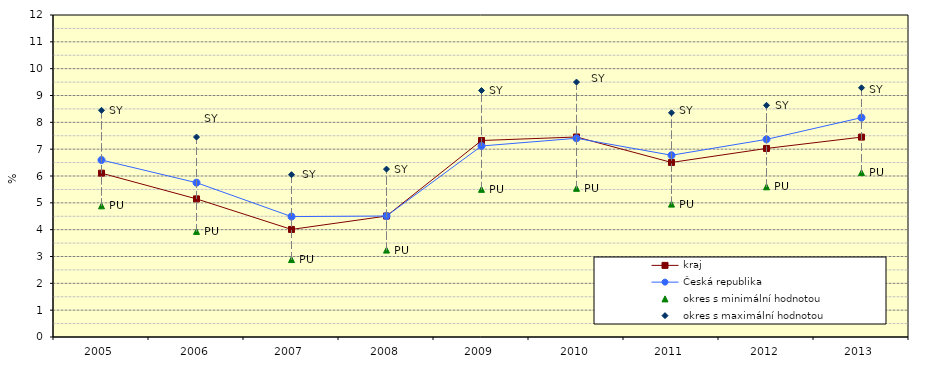
| Category | kraj | Česká republika | okres s minimální hodnotou | okres s maximální hodnotou |
|---|---|---|---|---|
| 2005.0 | 6.106 | 6.596 | 4.888 | 8.448 |
| 2006.0 | 5.147 | 5.751 | 3.936 | 7.452 |
| 2007.0 | 4.009 | 4.488 | 2.886 | 6.048 |
| 2008.0 | 4.507 | 4.508 | 3.238 | 6.258 |
| 2009.0 | 7.323 | 7.118 | 5.503 | 9.185 |
| 2010.0 | 7.454 | 7.406 | 5.541 | 9.501 |
| 2011.0 | 6.505 | 6.774 | 4.952 | 8.356 |
| 2012.0 | 7.027 | 7.367 | 5.597 | 8.636 |
| 2013.0 | 7.45 | 8.175 | 6.127 | 9.288 |